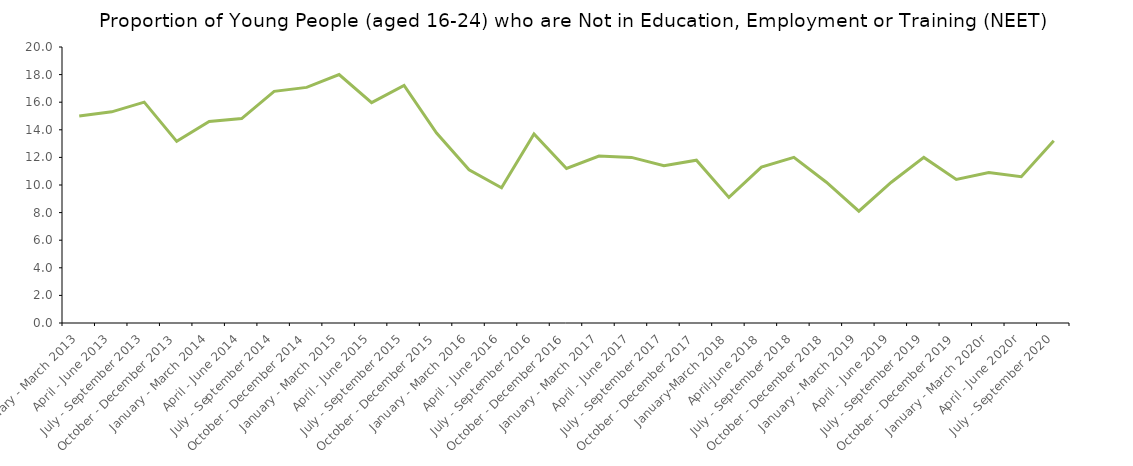
| Category | Series 2 |
|---|---|
| January - March 2013 | 15 |
| April - June 2013 | 15.3 |
| July - September 2013 | 16.006 |
| October - December 2013 | 13.163 |
| January - March 2014 | 14.6 |
| April - June 2014 | 14.811 |
| July - September 2014 | 16.785 |
| October - December 2014 | 17.073 |
| January - March 2015 | 18 |
| April - June 2015 | 15.972 |
| July - September 2015 | 17.216 |
| October - December 2015 | 13.765 |
| January - March 2016 | 11.1 |
| April - June 2016 | 9.8 |
| July - September 2016 | 13.7 |
| October - December 2016 | 11.2 |
| January - March 2017 | 12.1 |
| April - June 2017 | 12 |
| July - September 2017 | 11.4 |
| October - December 2017 | 11.8 |
| January-March 2018 | 9.1 |
| April-June 2018 | 11.3 |
| July - September 2018 | 12 |
| October - December 2018 | 10.2 |
| January - March 2019 | 8.1 |
| April - June 2019 | 10.2 |
| July - September 2019 | 12 |
| October - December 2019 | 10.4 |
| January - March 2020r | 10.9 |
| April - June 2020r | 10.6 |
| July - September 2020 | 13.2 |